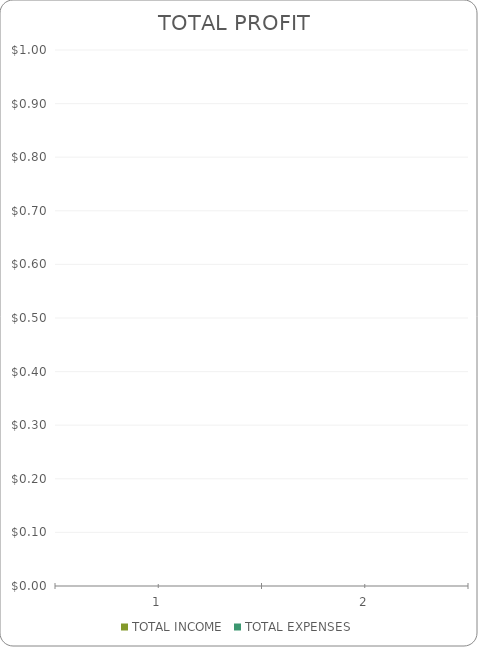
| Category | TOTAL INCOME | TOTAL EXPENSES |
|---|---|---|
| 0 | 0 | 0 |
| 1 | 0 | 0 |